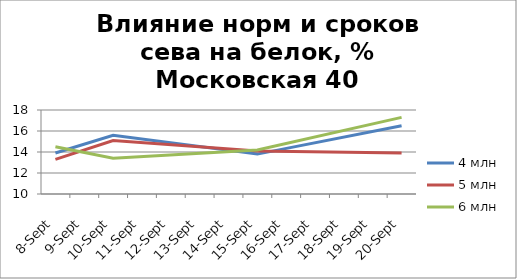
| Category | 4 млн | 5 млн | 6 млн |
|---|---|---|---|
| 2016-09-08 | 13.9 | 13.3 | 14.5 |
| 2016-09-10 | 15.6 | 15.1 | 13.4 |
| 2016-09-15 | 13.8 | 14.1 | 14.2 |
| 2016-09-20 | 16.5 | 13.9 | 17.3 |